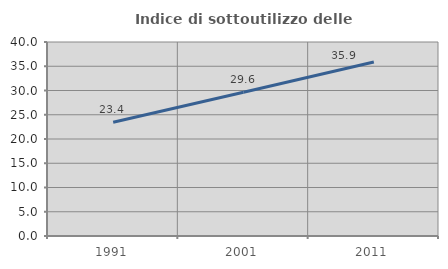
| Category | Indice di sottoutilizzo delle abitazioni  |
|---|---|
| 1991.0 | 23.444 |
| 2001.0 | 29.642 |
| 2011.0 | 35.872 |